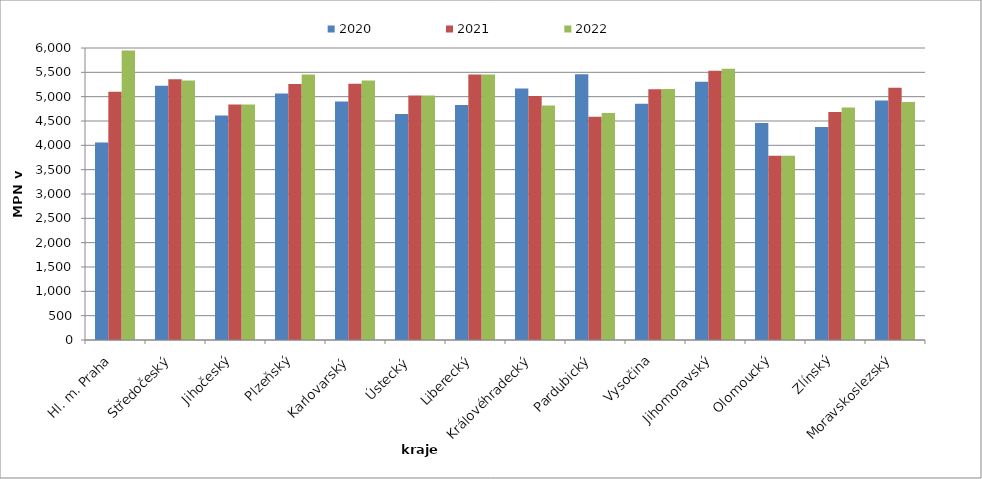
| Category | 2020 | 2021 | 2022 |
|---|---|---|---|
| Hl. m. Praha | 4057 | 5103 | 5949 |
| Středočeský | 5226 | 5358 | 5332 |
| Jihočeský | 4611 | 4837 | 4837 |
| Plzeňský | 5063 | 5258 | 5457 |
| Karlovarský  | 4899 | 5267 | 5332 |
| Ústecký   | 4645 | 5026 | 5026 |
| Liberecký | 4827 | 5453 | 5453 |
| Královéhradecký | 5167 | 5014 | 4819 |
| Pardubický | 5463 | 4589 | 4662 |
| Vysočina | 4855 | 5153 | 5157 |
| Jihomoravský | 5305 | 5535 | 5573 |
| Olomoucký | 4458 | 3784 | 3784 |
| Zlínský | 4377 | 4686 | 4779 |
| Moravskoslezský | 4919 | 5182 | 4888 |